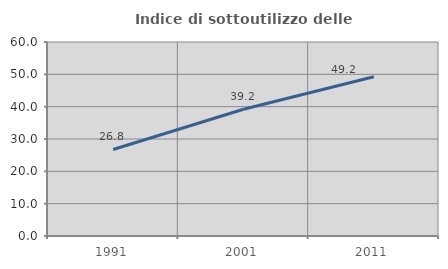
| Category | Indice di sottoutilizzo delle abitazioni  |
|---|---|
| 1991.0 | 26.755 |
| 2001.0 | 39.187 |
| 2011.0 | 49.236 |